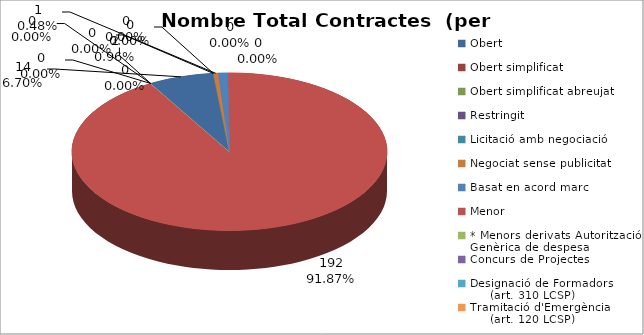
| Category | Nombre Total Contractes |
|---|---|
| Obert | 14 |
| Obert simplificat | 0 |
| Obert simplificat abreujat | 0 |
| Restringit | 0 |
| Licitació amb negociació | 0 |
| Negociat sense publicitat | 1 |
| Basat en acord marc | 2 |
| Menor | 192 |
| * Menors derivats Autorització Genèrica de despesa | 0 |
| Concurs de Projectes | 0 |
| Designació de Formadors
     (art. 310 LCSP) | 0 |
| Tramitació d'Emergència
     (art. 120 LCSP) | 0 |